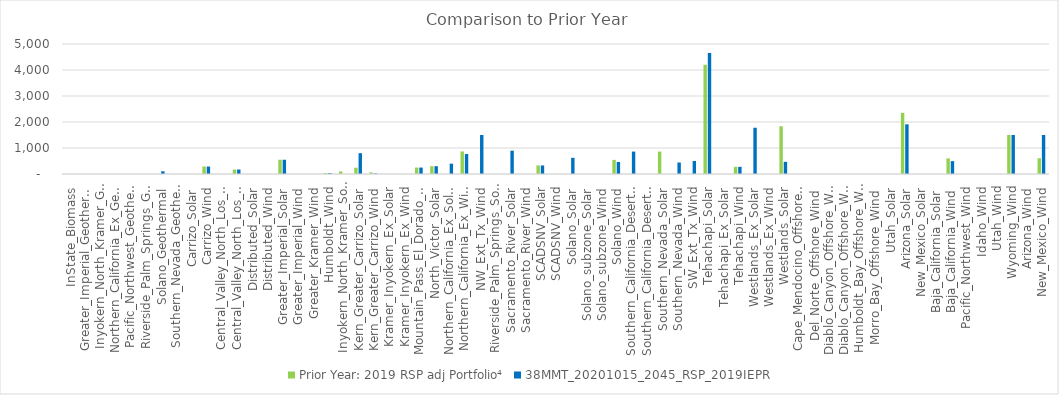
| Category | Prior Year: 2019 RSP adj Portfolio⁴ |  38MMT_20201015_2045_RSP_2019IEPR  |
|---|---|---|
| InState_Biomass | 0 | 0 |
| Greater_Imperial_Geothermal | 0 | 0 |
| Inyokern_North_Kramer_Geothermal | 0 | 0 |
| Northern_California_Ex_Geothermal | 0 | 0 |
| Pacific_Northwest_Geothermal | 0 | 0 |
| Riverside_Palm_Springs_Geothermal | 0 | 0 |
| Solano_Geothermal | 0 | 105 |
| Southern_Nevada_Geothermal | 0 | 0 |
| Carrizo_Solar | 0 | 0 |
| Carrizo_Wind | 287 | 287 |
| Central_Valley_North_Los_Banos_Solar | 0 | 0 |
| Central_Valley_North_Los_Banos_Wind | 173 | 173 |
| Distributed_Solar | 0 | 0 |
| Distributed_Wind | 0 | 0 |
| Greater_Imperial_Solar | 548 | 548 |
| Greater_Imperial_Wind | 0 | 0 |
| Greater_Kramer_Wind | 0 | 0 |
| Humboldt_Wind | 34 | 34 |
| Inyokern_North_Kramer_Solar | 97 | 0 |
| Kern_Greater_Carrizo_Solar | 242 | 801.32 |
| Kern_Greater_Carrizo_Wind | 60 | 20 |
| Kramer_Inyokern_Ex_Solar | 0 | 0 |
| Kramer_Inyokern_Ex_Wind | 0 | 0 |
| Mountain_Pass_El_Dorado_Solar | 248 | 248 |
| North_Victor_Solar | 300 | 300 |
| Northern_California_Ex_Solar | 0 | 397 |
| Northern_California_Ex_Wind | 866 | 767 |
| NW_Ext_Tx_Wind | 0 | 1500 |
| Riverside_Palm_Springs_Solar | 0 | 0 |
| Sacramento_River_Solar | 0 | 896 |
| Sacramento_River_Wind | 0 | 0 |
| SCADSNV_Solar | 330 | 330 |
| SCADSNV_Wind | 0 | 0 |
| Solano_Solar | 0 | 622 |
| Solano_subzone_Solar | 0 | 0 |
| Solano_subzone_Wind | 0 | 0 |
| Solano_Wind | 542 | 462 |
| Southern_California_Desert_Ex_Solar | 0 | 862 |
| Southern_California_Desert_Ex_Wind | 0 | 0 |
| Southern_Nevada_Solar | 862 | 0 |
| Southern_Nevada_Wind | 0 | 442 |
| SW_Ext_Tx_Wind | 0 | 500 |
| Tehachapi_Solar | 4202 | 4656 |
| Tehachapi_Ex_Solar | 0 | 0 |
| Tehachapi_Wind | 275 | 275 |
| Westlands_Ex_Solar | 0 | 1779 |
| Westlands_Ex_Wind | 0 | 0 |
| Westlands_Solar | 1836 | 468 |
| Cape_Mendocino_Offshore_Wind | 0 | 0 |
| Del_Norte_Offshore_Wind | 0 | 0 |
| Diablo_Canyon_Offshore_Wind_Ext_Tx | 0 | 0 |
| Diablo_Canyon_Offshore_Wind | 0 | 0 |
| Humboldt_Bay_Offshore_Wind | 0 | 0 |
| Morro_Bay_Offshore_Wind | 0 | 0 |
| Utah_Solar | 0 | 0 |
| Arizona_Solar | 2352 | 1910 |
| New_Mexico_Solar | 0 | 0 |
| Baja_California_Solar | 0 | 0 |
| Baja_California_Wind | 600 | 495 |
| Pacific_Northwest_Wind | 0 | 0 |
| Idaho_Wind | 0 | 0 |
| Utah_Wind | 0 | 0 |
| Wyoming_Wind | 1500 | 1500 |
| Arizona_Wind | 0 | 0 |
| New_Mexico_Wind | 606 | 1500 |